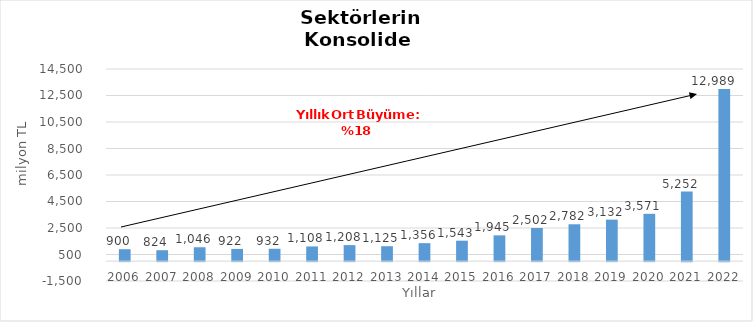
| Category | Toplam |
|---|---|
| 2006.0 | 900.249 |
| 2007.0 | 824.279 |
| 2008.0 | 1046.34 |
| 2009.0 | 921.592 |
| 2010.0 | 931.985 |
| 2011.0 | 1107.741 |
| 2012.0 | 1207.621 |
| 2013.0 | 1125.414 |
| 2014.0 | 1355.909 |
| 2015.0 | 1543 |
| 2016.0 | 1945 |
| 2017.0 | 2502 |
| 2018.0 | 2782 |
| 2019.0 | 3132 |
| 2020.0 | 3571 |
| 2021.0 | 5252 |
| 2022.0 | 12989 |